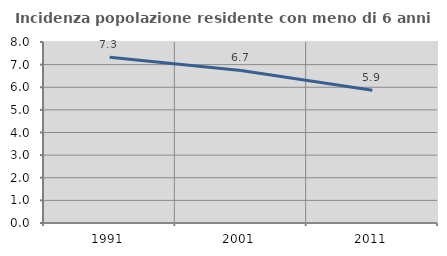
| Category | Incidenza popolazione residente con meno di 6 anni |
|---|---|
| 1991.0 | 7.324 |
| 2001.0 | 6.742 |
| 2011.0 | 5.867 |